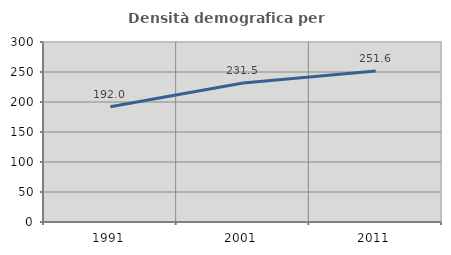
| Category | Densità demografica |
|---|---|
| 1991.0 | 192.037 |
| 2001.0 | 231.515 |
| 2011.0 | 251.552 |